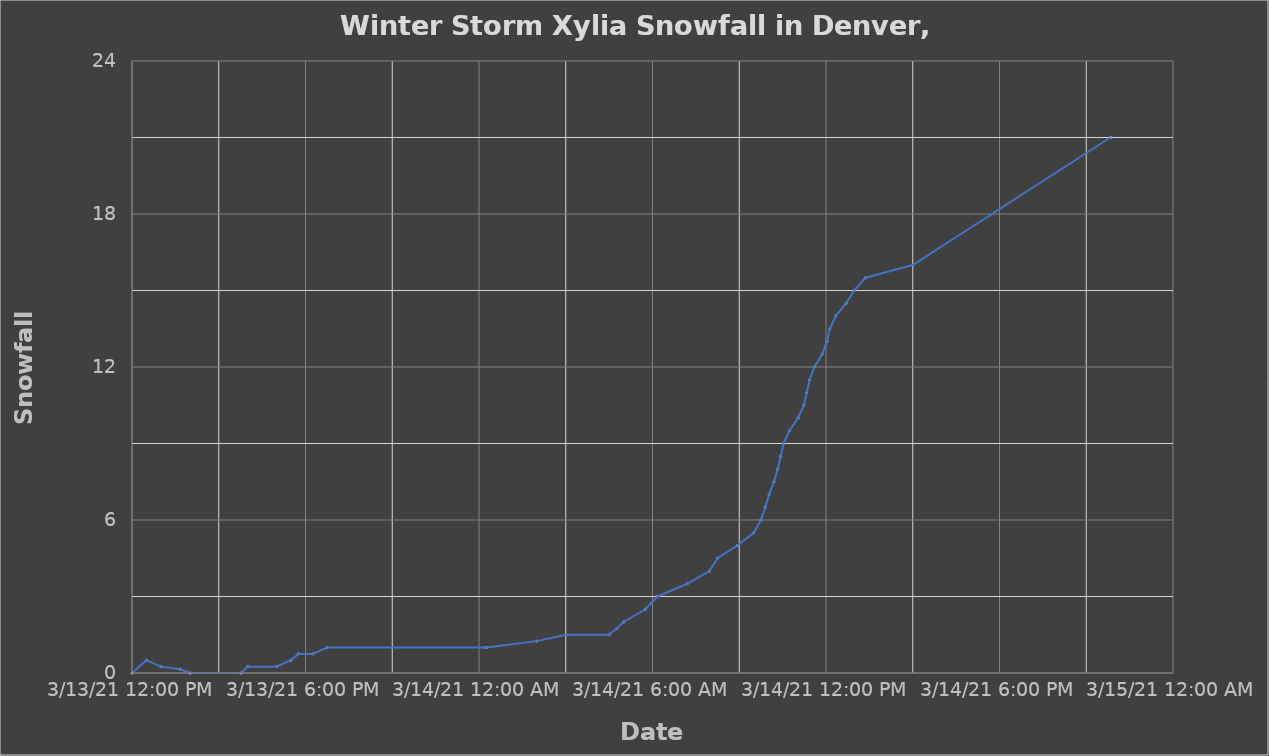
| Category | Snowfall (inches) |
|---|---|
| 44267.791666666664 | 0 |
| 44268.5 | 0 |
| 44268.520833333336 | 0.5 |
| 44268.541666666664 | 0.25 |
| 44268.569444444445 | 0.15 |
| 44268.583333333336 | 0 |
| 44268.65694444445 | 0 |
| 44268.666666666664 | 0.25 |
| 44268.708333333336 | 0.25 |
| 44268.729166666664 | 0.5 |
| 44268.739583333336 | 0.75 |
| 44268.760416666664 | 0.75 |
| 44268.78125 | 1 |
| 44269.010416666664 | 1 |
| 44269.083333333336 | 1.25 |
| 44269.125 | 1.5 |
| 44269.1875 | 1.5 |
| 44269.19861111111 | 1.75 |
| 44269.208333333336 | 2 |
| 44269.239583333336 | 2.5 |
| 44269.256944444445 | 3 |
| 44269.3 | 3.5 |
| 44269.33194444444 | 4 |
| 44269.34375 | 4.5 |
| 44269.37222222222 | 5 |
| 44269.395833333336 | 5.5 |
| 44269.40625 | 6 |
| 44269.4125 | 6.5 |
| 44269.41805555556 | 7 |
| 44269.425 | 7.5 |
| 44269.430555555555 | 8 |
| 44269.43472222222 | 8.5 |
| 44269.438888888886 | 9 |
| 44269.447222222225 | 9.5 |
| 44269.45972222222 | 10 |
| 44269.46805555555 | 10.5 |
| 44269.47222222222 | 11 |
| 44269.47638888889 | 11.5 |
| 44269.48333333333 | 12 |
| 44269.49444444444 | 12.5 |
| 44269.501388888886 | 13 |
| 44269.50555555556 | 13.5 |
| 44269.51388888889 | 14 |
| 44269.52916666667 | 14.5 |
| 44269.54027777778 | 15 |
| 44269.55694444444 | 15.5 |
| 44269.625 | 16 |
| 44269.90972222222 | 21 |